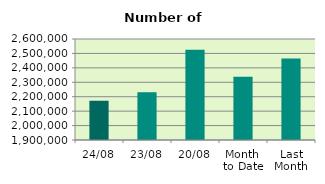
| Category | Series 0 |
|---|---|
| 24/08 | 2172118 |
| 23/08 | 2231086 |
| 20/08 | 2526284 |
| Month 
to Date | 2337802.353 |
| Last
Month | 2465054.636 |